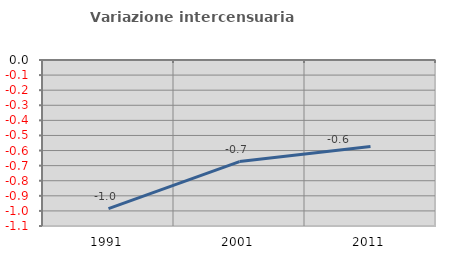
| Category | Variazione intercensuaria annua |
|---|---|
| 1991.0 | -0.985 |
| 2001.0 | -0.673 |
| 2011.0 | -0.573 |